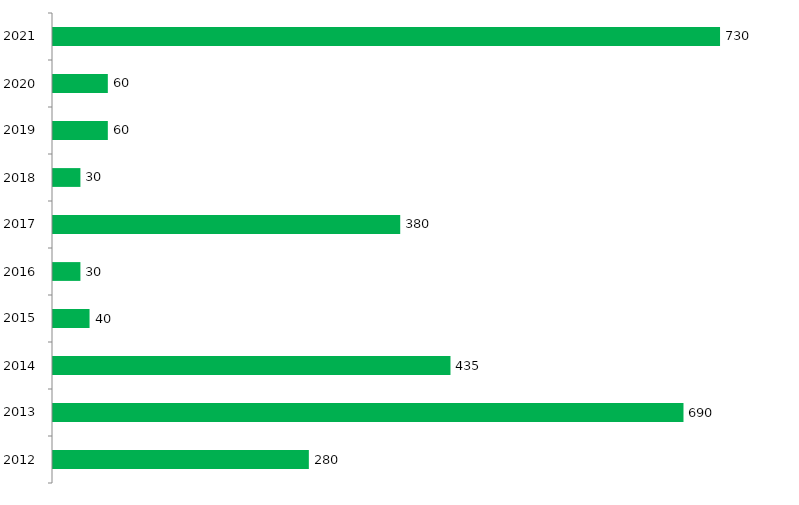
| Category | Series 1 |
|---|---|
| 2012.0 | 280 |
| 2013.0 | 690 |
| 2014.0 | 435 |
| 2015.0 | 40 |
| 2016.0 | 30 |
| 2017.0 | 380 |
| 2018.0 | 30 |
| 2019.0 | 60 |
| 2020.0 | 60 |
| 2021.0 | 730 |